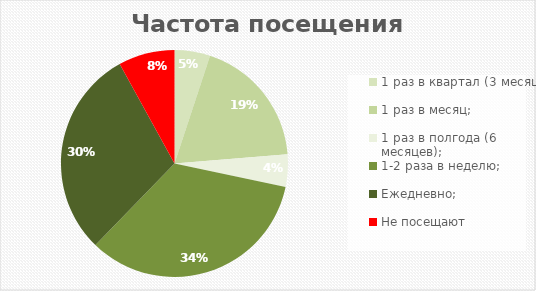
| Category | Итог |
|---|---|
| 1 раз в квартал (3 месяца); | 43 |
| 1 раз в месяц; | 158 |
| 1 раз в полгода (6 месяцев); | 39 |
| 1-2 раза в неделю; | 288 |
| Ежедневно; | 252 |
| Не посещают | 68 |